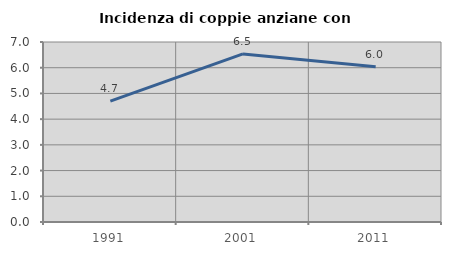
| Category | Incidenza di coppie anziane con figli |
|---|---|
| 1991.0 | 4.698 |
| 2001.0 | 6.536 |
| 2011.0 | 6.04 |